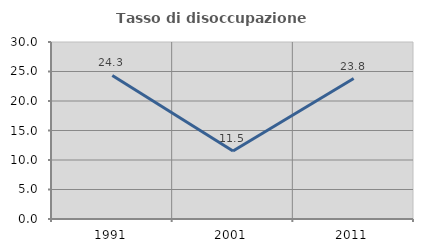
| Category | Tasso di disoccupazione giovanile  |
|---|---|
| 1991.0 | 24.324 |
| 2001.0 | 11.538 |
| 2011.0 | 23.81 |